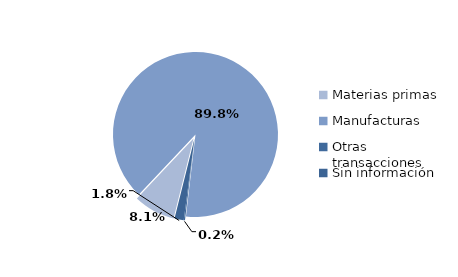
| Category | Series 0 |
|---|---|
| Materias primas | 883.662 |
| Manufacturas | 9737.78 |
| Otras transacciones | 25.419 |
| Sin información | 196.003 |